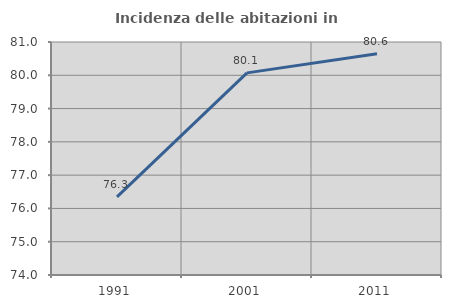
| Category | Incidenza delle abitazioni in proprietà  |
|---|---|
| 1991.0 | 76.345 |
| 2001.0 | 80.073 |
| 2011.0 | 80.646 |